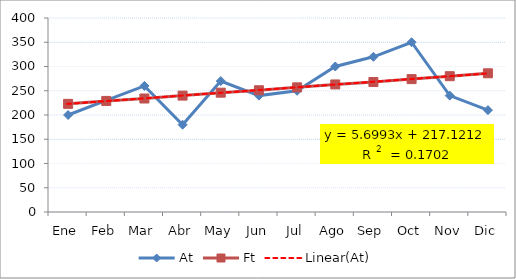
| Category | At | Ft |
|---|---|---|
| Ene | 200 | 223 |
| Feb | 230 | 229 |
| Mar | 260 | 234 |
| Abr | 180 | 240 |
| May | 270 | 246 |
| Jun | 240 | 251 |
| Jul | 250 | 257 |
| Ago | 300 | 263 |
| Sep | 320 | 268 |
| Oct | 350 | 274 |
| Nov | 240 | 280 |
| Dic | 210 | 286 |